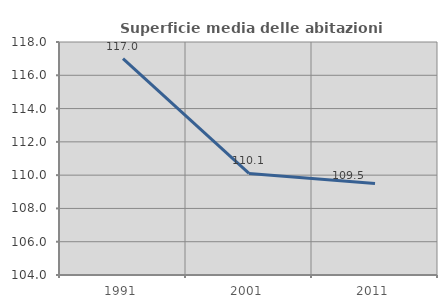
| Category | Superficie media delle abitazioni occupate |
|---|---|
| 1991.0 | 116.996 |
| 2001.0 | 110.104 |
| 2011.0 | 109.501 |